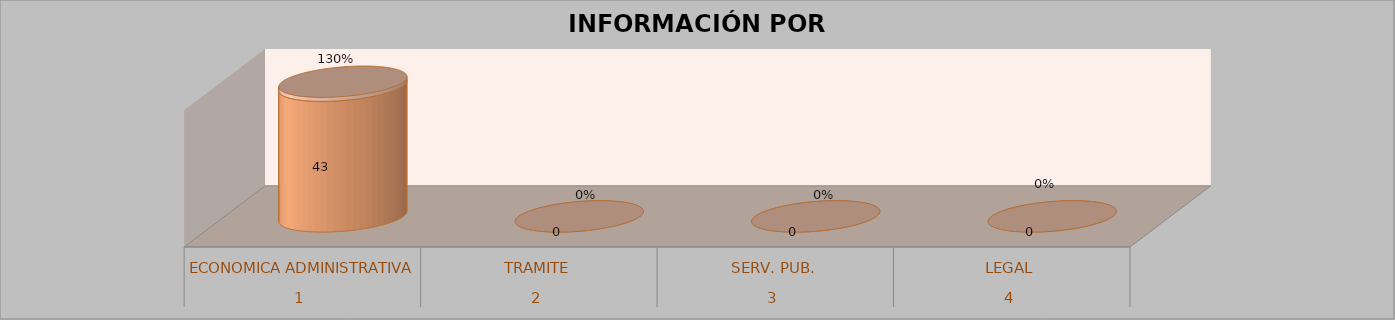
| Category | Series 0 | Series 1 | Series 2 | Series 3 |
|---|---|---|---|---|
| 0 |  |  | 43 | 1.303 |
| 1 |  |  | 0 | 0 |
| 2 |  |  | 0 | 0 |
| 3 |  |  | 0 | 0 |